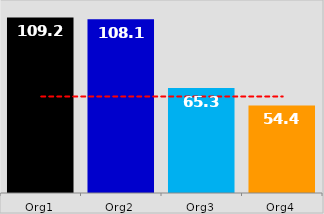
| Category | KPI / Metric |
|---|---|
| Org1 | 109.167 |
| Org2 | 108.083 |
| Org3 | 65.333 |
| Org4 | 54.417 |